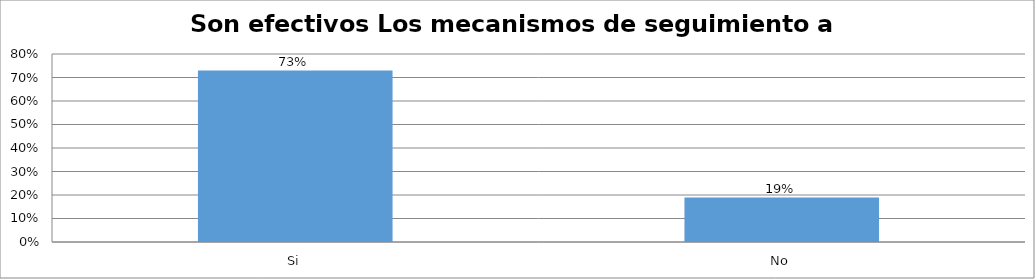
| Category | Series 0 |
|---|---|
| Si | 0.73 |
| No | 0.189 |